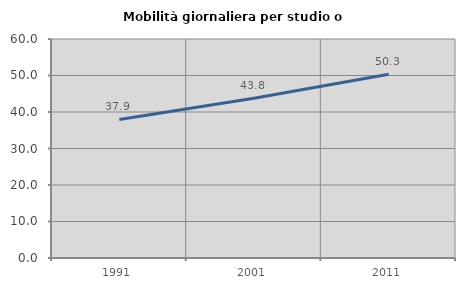
| Category | Mobilità giornaliera per studio o lavoro |
|---|---|
| 1991.0 | 37.947 |
| 2001.0 | 43.75 |
| 2011.0 | 50.321 |